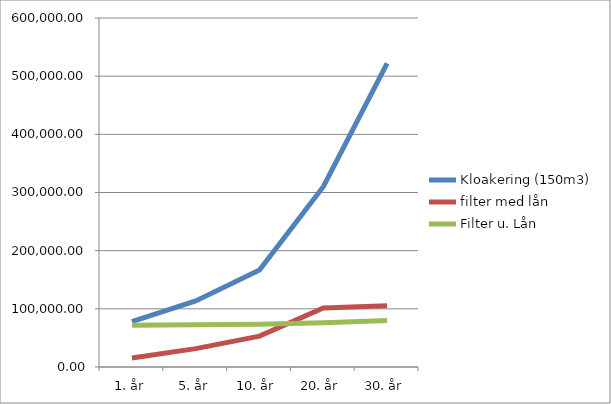
| Category | Kloakering (150m3) | filter med lån | Filter u. Lån |
|---|---|---|---|
| 1. år | 77872.07 | 15502 | 71800 |
| 5. år | 113478.671 | 31566.448 | 72462.448 |
| 10. år | 166608.809 | 53143.916 | 73450.916 |
| 20. år | 309895.329 | 101442.712 | 76116.712 |
| 30. år | 521994.381 | 105388.741 | 80062.741 |